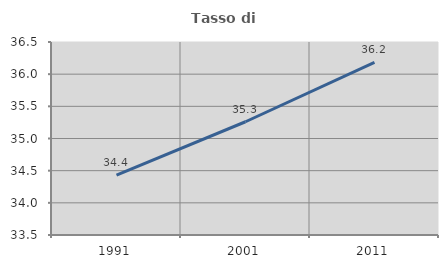
| Category | Tasso di occupazione   |
|---|---|
| 1991.0 | 34.43 |
| 2001.0 | 35.26 |
| 2011.0 | 36.185 |